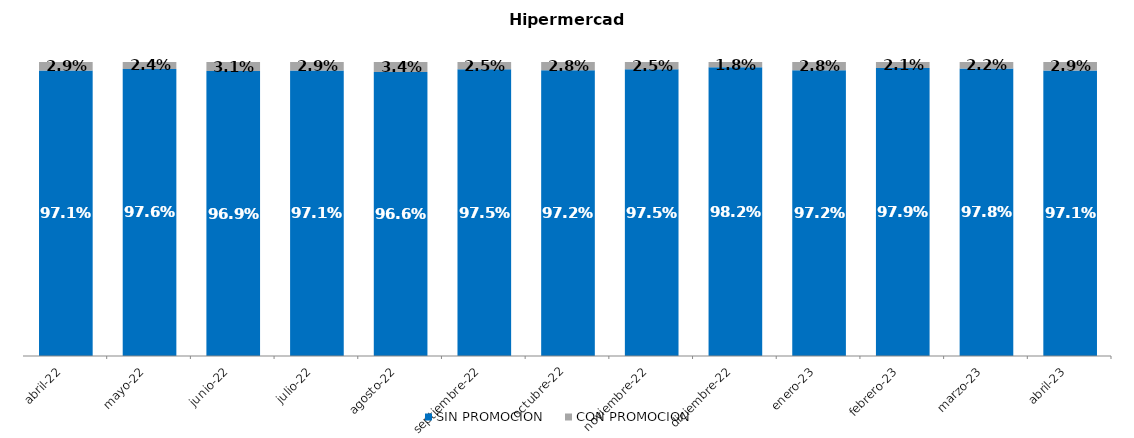
| Category | SIN PROMOCION   | CON PROMOCION   |
|---|---|---|
| 2022-04-01 | 0.971 | 0.029 |
| 2022-05-01 | 0.976 | 0.024 |
| 2022-06-01 | 0.969 | 0.031 |
| 2022-07-01 | 0.971 | 0.029 |
| 2022-08-01 | 0.966 | 0.034 |
| 2022-09-01 | 0.975 | 0.025 |
| 2022-10-01 | 0.972 | 0.028 |
| 2022-11-01 | 0.975 | 0.025 |
| 2022-12-01 | 0.982 | 0.018 |
| 2023-01-01 | 0.972 | 0.028 |
| 2023-02-01 | 0.979 | 0.021 |
| 2023-03-01 | 0.978 | 0.022 |
| 2023-04-01 | 0.971 | 0.029 |